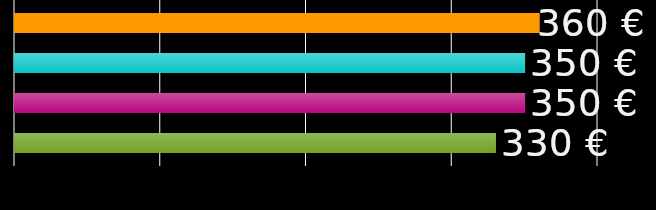
| Category | colega de quarto 1 | colega de quarto 2 | colega de quarto 3 | colega de quarto 4 |
|---|---|---|---|---|
| 0 | 360 | 350 | 350 | 330 |